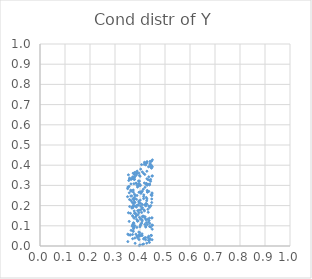
| Category | Series 0 |
|---|---|
| -100.0 | -100 |
| -100.0 | -100 |
| -100.0 | -100 |
| 0.4030961448478464 | 0.107 |
| -100.0 | -100 |
| -100.0 | -100 |
| -100.0 | -100 |
| -100.0 | -100 |
| -100.0 | -100 |
| -100.0 | -100 |
| -100.0 | -100 |
| 0.37293624094596356 | 0.339 |
| -100.0 | -100 |
| -100.0 | -100 |
| -100.0 | -100 |
| -100.0 | -100 |
| -100.0 | -100 |
| -100.0 | -100 |
| -100.0 | -100 |
| -100.0 | -100 |
| -100.0 | -100 |
| 0.3800242393108513 | 0.216 |
| -100.0 | -100 |
| -100.0 | -100 |
| -100.0 | -100 |
| -100.0 | -100 |
| -100.0 | -100 |
| -100.0 | -100 |
| -100.0 | -100 |
| -100.0 | -100 |
| -100.0 | -100 |
| -100.0 | -100 |
| -100.0 | -100 |
| -100.0 | -100 |
| -100.0 | -100 |
| -100.0 | -100 |
| -100.0 | -100 |
| 0.4085836126790914 | 0.052 |
| -100.0 | -100 |
| -100.0 | -100 |
| -100.0 | -100 |
| -100.0 | -100 |
| -100.0 | -100 |
| -100.0 | -100 |
| -100.0 | -100 |
| 0.4129208425187807 | 0.148 |
| -100.0 | -100 |
| -100.0 | -100 |
| -100.0 | -100 |
| -100.0 | -100 |
| -100.0 | -100 |
| -100.0 | -100 |
| -100.0 | -100 |
| -100.0 | -100 |
| -100.0 | -100 |
| 0.37795517911840815 | 0.329 |
| -100.0 | -100 |
| -100.0 | -100 |
| -100.0 | -100 |
| -100.0 | -100 |
| -100.0 | -100 |
| -100.0 | -100 |
| 0.4089082786524332 | 0.124 |
| -100.0 | -100 |
| -100.0 | -100 |
| -100.0 | -100 |
| -100.0 | -100 |
| -100.0 | -100 |
| -100.0 | -100 |
| -100.0 | -100 |
| -100.0 | -100 |
| -100.0 | -100 |
| -100.0 | -100 |
| -100.0 | -100 |
| -100.0 | -100 |
| -100.0 | -100 |
| -100.0 | -100 |
| -100.0 | -100 |
| -100.0 | -100 |
| -100.0 | -100 |
| -100.0 | -100 |
| -100.0 | -100 |
| -100.0 | -100 |
| -100.0 | -100 |
| -100.0 | -100 |
| -100.0 | -100 |
| -100.0 | -100 |
| -100.0 | -100 |
| -100.0 | -100 |
| 0.3977890599794355 | 0.321 |
| -100.0 | -100 |
| 0.42225708203498835 | 0.031 |
| -100.0 | -100 |
| -100.0 | -100 |
| -100.0 | -100 |
| -100.0 | -100 |
| -100.0 | -100 |
| -100.0 | -100 |
| -100.0 | -100 |
| -100.0 | -100 |
| -100.0 | -100 |
| -100.0 | -100 |
| -100.0 | -100 |
| -100.0 | -100 |
| -100.0 | -100 |
| -100.0 | -100 |
| -100.0 | -100 |
| -100.0 | -100 |
| -100.0 | -100 |
| -100.0 | -100 |
| -100.0 | -100 |
| -100.0 | -100 |
| -100.0 | -100 |
| -100.0 | -100 |
| -100.0 | -100 |
| -100.0 | -100 |
| -100.0 | -100 |
| -100.0 | -100 |
| 0.44568755198835497 | 0.399 |
| -100.0 | -100 |
| -100.0 | -100 |
| -100.0 | -100 |
| -100.0 | -100 |
| -100.0 | -100 |
| -100.0 | -100 |
| 0.3881679715345008 | 0.36 |
| 0.37787363267203233 | 0.256 |
| -100.0 | -100 |
| -100.0 | -100 |
| -100.0 | -100 |
| -100.0 | -100 |
| -100.0 | -100 |
| -100.0 | -100 |
| -100.0 | -100 |
| -100.0 | -100 |
| -100.0 | -100 |
| -100.0 | -100 |
| -100.0 | -100 |
| -100.0 | -100 |
| -100.0 | -100 |
| -100.0 | -100 |
| -100.0 | -100 |
| -100.0 | -100 |
| -100.0 | -100 |
| -100.0 | -100 |
| -100.0 | -100 |
| -100.0 | -100 |
| -100.0 | -100 |
| -100.0 | -100 |
| 0.43490849082456196 | 0.198 |
| -100.0 | -100 |
| -100.0 | -100 |
| -100.0 | -100 |
| -100.0 | -100 |
| -100.0 | -100 |
| -100.0 | -100 |
| -100.0 | -100 |
| -100.0 | -100 |
| -100.0 | -100 |
| -100.0 | -100 |
| -100.0 | -100 |
| -100.0 | -100 |
| 0.39509629361360576 | 0.177 |
| -100.0 | -100 |
| -100.0 | -100 |
| -100.0 | -100 |
| -100.0 | -100 |
| -100.0 | -100 |
| -100.0 | -100 |
| -100.0 | -100 |
| -100.0 | -100 |
| -100.0 | -100 |
| -100.0 | -100 |
| -100.0 | -100 |
| -100.0 | -100 |
| -100.0 | -100 |
| -100.0 | -100 |
| -100.0 | -100 |
| -100.0 | -100 |
| -100.0 | -100 |
| -100.0 | -100 |
| -100.0 | -100 |
| -100.0 | -100 |
| -100.0 | -100 |
| -100.0 | -100 |
| -100.0 | -100 |
| -100.0 | -100 |
| -100.0 | -100 |
| -100.0 | -100 |
| -100.0 | -100 |
| -100.0 | -100 |
| -100.0 | -100 |
| -100.0 | -100 |
| -100.0 | -100 |
| -100.0 | -100 |
| -100.0 | -100 |
| -100.0 | -100 |
| -100.0 | -100 |
| -100.0 | -100 |
| -100.0 | -100 |
| -100.0 | -100 |
| -100.0 | -100 |
| -100.0 | -100 |
| -100.0 | -100 |
| -100.0 | -100 |
| -100.0 | -100 |
| -100.0 | -100 |
| -100.0 | -100 |
| -100.0 | -100 |
| -100.0 | -100 |
| -100.0 | -100 |
| -100.0 | -100 |
| -100.0 | -100 |
| -100.0 | -100 |
| -100.0 | -100 |
| -100.0 | -100 |
| -100.0 | -100 |
| -100.0 | -100 |
| -100.0 | -100 |
| -100.0 | -100 |
| -100.0 | -100 |
| -100.0 | -100 |
| -100.0 | -100 |
| -100.0 | -100 |
| -100.0 | -100 |
| -100.0 | -100 |
| 0.4151417506024939 | 0.253 |
| -100.0 | -100 |
| -100.0 | -100 |
| -100.0 | -100 |
| -100.0 | -100 |
| -100.0 | -100 |
| -100.0 | -100 |
| -100.0 | -100 |
| 0.40089803095129684 | 0.177 |
| -100.0 | -100 |
| -100.0 | -100 |
| -100.0 | -100 |
| -100.0 | -100 |
| -100.0 | -100 |
| -100.0 | -100 |
| -100.0 | -100 |
| -100.0 | -100 |
| -100.0 | -100 |
| -100.0 | -100 |
| -100.0 | -100 |
| -100.0 | -100 |
| -100.0 | -100 |
| -100.0 | -100 |
| -100.0 | -100 |
| -100.0 | -100 |
| 0.3764962696208588 | 0.137 |
| -100.0 | -100 |
| -100.0 | -100 |
| 0.37414906566845263 | 0.208 |
| -100.0 | -100 |
| -100.0 | -100 |
| -100.0 | -100 |
| -100.0 | -100 |
| 0.42750771989362524 | 0.37 |
| -100.0 | -100 |
| -100.0 | -100 |
| -100.0 | -100 |
| -100.0 | -100 |
| -100.0 | -100 |
| -100.0 | -100 |
| -100.0 | -100 |
| 0.37648879085468834 | 0.358 |
| -100.0 | -100 |
| -100.0 | -100 |
| -100.0 | -100 |
| -100.0 | -100 |
| -100.0 | -100 |
| -100.0 | -100 |
| -100.0 | -100 |
| -100.0 | -100 |
| -100.0 | -100 |
| -100.0 | -100 |
| -100.0 | -100 |
| -100.0 | -100 |
| -100.0 | -100 |
| -100.0 | -100 |
| -100.0 | -100 |
| -100.0 | -100 |
| -100.0 | -100 |
| -100.0 | -100 |
| -100.0 | -100 |
| -100.0 | -100 |
| -100.0 | -100 |
| -100.0 | -100 |
| -100.0 | -100 |
| -100.0 | -100 |
| -100.0 | -100 |
| -100.0 | -100 |
| -100.0 | -100 |
| -100.0 | -100 |
| -100.0 | -100 |
| -100.0 | -100 |
| -100.0 | -100 |
| -100.0 | -100 |
| -100.0 | -100 |
| 0.38062372653307 | 0.249 |
| -100.0 | -100 |
| -100.0 | -100 |
| 0.42388650170796616 | 0.411 |
| -100.0 | -100 |
| -100.0 | -100 |
| -100.0 | -100 |
| -100.0 | -100 |
| -100.0 | -100 |
| -100.0 | -100 |
| -100.0 | -100 |
| -100.0 | -100 |
| 0.4230365105791567 | 0.402 |
| -100.0 | -100 |
| -100.0 | -100 |
| -100.0 | -100 |
| -100.0 | -100 |
| -100.0 | -100 |
| -100.0 | -100 |
| -100.0 | -100 |
| -100.0 | -100 |
| -100.0 | -100 |
| -100.0 | -100 |
| -100.0 | -100 |
| -100.0 | -100 |
| -100.0 | -100 |
| -100.0 | -100 |
| -100.0 | -100 |
| -100.0 | -100 |
| -100.0 | -100 |
| -100.0 | -100 |
| -100.0 | -100 |
| -100.0 | -100 |
| 0.4459119407256118 | 0.385 |
| -100.0 | -100 |
| -100.0 | -100 |
| -100.0 | -100 |
| 0.3997254120917545 | 0.005 |
| 0.40097214013508375 | 0.227 |
| -100.0 | -100 |
| -100.0 | -100 |
| -100.0 | -100 |
| -100.0 | -100 |
| -100.0 | -100 |
| -100.0 | -100 |
| -100.0 | -100 |
| -100.0 | -100 |
| -100.0 | -100 |
| -100.0 | -100 |
| -100.0 | -100 |
| -100.0 | -100 |
| 0.41422850753729257 | 0.01 |
| -100.0 | -100 |
| -100.0 | -100 |
| -100.0 | -100 |
| -100.0 | -100 |
| 0.3919025857117391 | 0.125 |
| -100.0 | -100 |
| -100.0 | -100 |
| 0.3881530465880212 | 0.25 |
| -100.0 | -100 |
| -100.0 | -100 |
| -100.0 | -100 |
| -100.0 | -100 |
| -100.0 | -100 |
| -100.0 | -100 |
| 0.3846643258345378 | 0.35 |
| -100.0 | -100 |
| 0.40351559675746695 | 0.196 |
| -100.0 | -100 |
| -100.0 | -100 |
| -100.0 | -100 |
| -100.0 | -100 |
| -100.0 | -100 |
| -100.0 | -100 |
| -100.0 | -100 |
| -100.0 | -100 |
| -100.0 | -100 |
| -100.0 | -100 |
| -100.0 | -100 |
| -100.0 | -100 |
| -100.0 | -100 |
| -100.0 | -100 |
| -100.0 | -100 |
| -100.0 | -100 |
| -100.0 | -100 |
| -100.0 | -100 |
| -100.0 | -100 |
| -100.0 | -100 |
| -100.0 | -100 |
| -100.0 | -100 |
| -100.0 | -100 |
| -100.0 | -100 |
| -100.0 | -100 |
| -100.0 | -100 |
| -100.0 | -100 |
| -100.0 | -100 |
| -100.0 | -100 |
| -100.0 | -100 |
| -100.0 | -100 |
| -100.0 | -100 |
| -100.0 | -100 |
| -100.0 | -100 |
| -100.0 | -100 |
| -100.0 | -100 |
| -100.0 | -100 |
| -100.0 | -100 |
| -100.0 | -100 |
| -100.0 | -100 |
| -100.0 | -100 |
| -100.0 | -100 |
| -100.0 | -100 |
| -100.0 | -100 |
| -100.0 | -100 |
| -100.0 | -100 |
| -100.0 | -100 |
| -100.0 | -100 |
| -100.0 | -100 |
| -100.0 | -100 |
| -100.0 | -100 |
| -100.0 | -100 |
| -100.0 | -100 |
| -100.0 | -100 |
| -100.0 | -100 |
| -100.0 | -100 |
| 0.3632194606941388 | 0.247 |
| -100.0 | -100 |
| 0.38135871574812985 | 0.162 |
| -100.0 | -100 |
| -100.0 | -100 |
| -100.0 | -100 |
| -100.0 | -100 |
| -100.0 | -100 |
| -100.0 | -100 |
| -100.0 | -100 |
| 0.42220412948663666 | 0.41 |
| 0.38840045820306146 | 0.05 |
| -100.0 | -100 |
| 0.44885670360411867 | 0.083 |
| 0.37470683176174624 | 0.086 |
| -100.0 | -100 |
| -100.0 | -100 |
| -100.0 | -100 |
| -100.0 | -100 |
| -100.0 | -100 |
| -100.0 | -100 |
| -100.0 | -100 |
| -100.0 | -100 |
| -100.0 | -100 |
| -100.0 | -100 |
| -100.0 | -100 |
| -100.0 | -100 |
| -100.0 | -100 |
| 0.35510610959932787 | 0.324 |
| -100.0 | -100 |
| -100.0 | -100 |
| -100.0 | -100 |
| -100.0 | -100 |
| -100.0 | -100 |
| 0.3994907125852676 | 0.304 |
| -100.0 | -100 |
| 0.4300881285031578 | 0.268 |
| -100.0 | -100 |
| -100.0 | -100 |
| -100.0 | -100 |
| -100.0 | -100 |
| -100.0 | -100 |
| -100.0 | -100 |
| -100.0 | -100 |
| -100.0 | -100 |
| -100.0 | -100 |
| -100.0 | -100 |
| -100.0 | -100 |
| -100.0 | -100 |
| -100.0 | -100 |
| -100.0 | -100 |
| -100.0 | -100 |
| -100.0 | -100 |
| -100.0 | -100 |
| -100.0 | -100 |
| -100.0 | -100 |
| -100.0 | -100 |
| -100.0 | -100 |
| -100.0 | -100 |
| -100.0 | -100 |
| -100.0 | -100 |
| -100.0 | -100 |
| -100.0 | -100 |
| -100.0 | -100 |
| -100.0 | -100 |
| -100.0 | -100 |
| 0.3636141934805067 | 0.307 |
| -100.0 | -100 |
| 0.3584349514063586 | 0.336 |
| -100.0 | -100 |
| -100.0 | -100 |
| -100.0 | -100 |
| -100.0 | -100 |
| -100.0 | -100 |
| 0.4276176083186315 | 0.333 |
| -100.0 | -100 |
| -100.0 | -100 |
| -100.0 | -100 |
| -100.0 | -100 |
| -100.0 | -100 |
| -100.0 | -100 |
| -100.0 | -100 |
| -100.0 | -100 |
| -100.0 | -100 |
| 0.41569367302651905 | 0.146 |
| -100.0 | -100 |
| 0.4378130437369947 | 0.018 |
| -100.0 | -100 |
| -100.0 | -100 |
| -100.0 | -100 |
| -100.0 | -100 |
| -100.0 | -100 |
| -100.0 | -100 |
| -100.0 | -100 |
| -100.0 | -100 |
| -100.0 | -100 |
| -100.0 | -100 |
| -100.0 | -100 |
| -100.0 | -100 |
| -100.0 | -100 |
| -100.0 | -100 |
| -100.0 | -100 |
| -100.0 | -100 |
| -100.0 | -100 |
| -100.0 | -100 |
| -100.0 | -100 |
| -100.0 | -100 |
| -100.0 | -100 |
| -100.0 | -100 |
| -100.0 | -100 |
| -100.0 | -100 |
| 0.3953061486688313 | 0.361 |
| -100.0 | -100 |
| -100.0 | -100 |
| -100.0 | -100 |
| -100.0 | -100 |
| -100.0 | -100 |
| -100.0 | -100 |
| -100.0 | -100 |
| -100.0 | -100 |
| -100.0 | -100 |
| -100.0 | -100 |
| -100.0 | -100 |
| -100.0 | -100 |
| -100.0 | -100 |
| -100.0 | -100 |
| -100.0 | -100 |
| -100.0 | -100 |
| -100.0 | -100 |
| -100.0 | -100 |
| -100.0 | -100 |
| -100.0 | -100 |
| -100.0 | -100 |
| -100.0 | -100 |
| -100.0 | -100 |
| -100.0 | -100 |
| -100.0 | -100 |
| -100.0 | -100 |
| -100.0 | -100 |
| -100.0 | -100 |
| -100.0 | -100 |
| 0.44574250133393956 | 0.052 |
| -100.0 | -100 |
| -100.0 | -100 |
| -100.0 | -100 |
| -100.0 | -100 |
| -100.0 | -100 |
| -100.0 | -100 |
| -100.0 | -100 |
| -100.0 | -100 |
| -100.0 | -100 |
| -100.0 | -100 |
| -100.0 | -100 |
| -100.0 | -100 |
| -100.0 | -100 |
| -100.0 | -100 |
| -100.0 | -100 |
| -100.0 | -100 |
| -100.0 | -100 |
| -100.0 | -100 |
| -100.0 | -100 |
| -100.0 | -100 |
| -100.0 | -100 |
| -100.0 | -100 |
| -100.0 | -100 |
| -100.0 | -100 |
| -100.0 | -100 |
| -100.0 | -100 |
| -100.0 | -100 |
| -100.0 | -100 |
| -100.0 | -100 |
| -100.0 | -100 |
| -100.0 | -100 |
| -100.0 | -100 |
| -100.0 | -100 |
| -100.0 | -100 |
| -100.0 | -100 |
| -100.0 | -100 |
| -100.0 | -100 |
| -100.0 | -100 |
| -100.0 | -100 |
| -100.0 | -100 |
| 0.40057174041979404 | 0.269 |
| -100.0 | -100 |
| -100.0 | -100 |
| -100.0 | -100 |
| -100.0 | -100 |
| -100.0 | -100 |
| -100.0 | -100 |
| -100.0 | -100 |
| -100.0 | -100 |
| -100.0 | -100 |
| -100.0 | -100 |
| 0.38859910196205927 | 0.371 |
| -100.0 | -100 |
| 0.42056813430008044 | 0.144 |
| -100.0 | -100 |
| -100.0 | -100 |
| -100.0 | -100 |
| -100.0 | -100 |
| 0.4068826903459747 | 0.183 |
| -100.0 | -100 |
| -100.0 | -100 |
| -100.0 | -100 |
| -100.0 | -100 |
| -100.0 | -100 |
| -100.0 | -100 |
| -100.0 | -100 |
| -100.0 | -100 |
| -100.0 | -100 |
| 0.40848756509885453 | 0.129 |
| -100.0 | -100 |
| 0.3544601788902032 | 0.056 |
| -100.0 | -100 |
| -100.0 | -100 |
| -100.0 | -100 |
| -100.0 | -100 |
| -100.0 | -100 |
| -100.0 | -100 |
| -100.0 | -100 |
| -100.0 | -100 |
| -100.0 | -100 |
| -100.0 | -100 |
| -100.0 | -100 |
| -100.0 | -100 |
| 0.4479291262277878 | 0.346 |
| -100.0 | -100 |
| -100.0 | -100 |
| -100.0 | -100 |
| -100.0 | -100 |
| -100.0 | -100 |
| -100.0 | -100 |
| -100.0 | -100 |
| 0.3768238514534964 | 0.174 |
| 0.40177983139797113 | 0.134 |
| -100.0 | -100 |
| -100.0 | -100 |
| -100.0 | -100 |
| -100.0 | -100 |
| 0.4383077338607314 | 0.097 |
| -100.0 | -100 |
| 0.4234114934400831 | 0.198 |
| -100.0 | -100 |
| 0.408921498935647 | 0.27 |
| -100.0 | -100 |
| -100.0 | -100 |
| -100.0 | -100 |
| -100.0 | -100 |
| -100.0 | -100 |
| -100.0 | -100 |
| -100.0 | -100 |
| -100.0 | -100 |
| -100.0 | -100 |
| -100.0 | -100 |
| -100.0 | -100 |
| -100.0 | -100 |
| -100.0 | -100 |
| 0.35123393985179185 | 0.059 |
| -100.0 | -100 |
| -100.0 | -100 |
| -100.0 | -100 |
| -100.0 | -100 |
| -100.0 | -100 |
| -100.0 | -100 |
| -100.0 | -100 |
| 0.4422018611547983 | 0.391 |
| -100.0 | -100 |
| -100.0 | -100 |
| -100.0 | -100 |
| -100.0 | -100 |
| -100.0 | -100 |
| -100.0 | -100 |
| -100.0 | -100 |
| -100.0 | -100 |
| -100.0 | -100 |
| -100.0 | -100 |
| -100.0 | -100 |
| -100.0 | -100 |
| -100.0 | -100 |
| -100.0 | -100 |
| -100.0 | -100 |
| 0.43386015037734627 | 0.118 |
| -100.0 | -100 |
| -100.0 | -100 |
| -100.0 | -100 |
| -100.0 | -100 |
| -100.0 | -100 |
| -100.0 | -100 |
| -100.0 | -100 |
| 0.36682742458321493 | 0.332 |
| -100.0 | -100 |
| -100.0 | -100 |
| -100.0 | -100 |
| -100.0 | -100 |
| -100.0 | -100 |
| -100.0 | -100 |
| -100.0 | -100 |
| -100.0 | -100 |
| 0.43954444319227426 | 0.111 |
| 0.39593338749045826 | 0.055 |
| 0.4180381352778284 | 0.174 |
| -100.0 | -100 |
| -100.0 | -100 |
| -100.0 | -100 |
| -100.0 | -100 |
| -100.0 | -100 |
| -100.0 | -100 |
| -100.0 | -100 |
| -100.0 | -100 |
| -100.0 | -100 |
| -100.0 | -100 |
| -100.0 | -100 |
| -100.0 | -100 |
| -100.0 | -100 |
| -100.0 | -100 |
| -100.0 | -100 |
| -100.0 | -100 |
| -100.0 | -100 |
| -100.0 | -100 |
| -100.0 | -100 |
| -100.0 | -100 |
| -100.0 | -100 |
| -100.0 | -100 |
| 0.3805419981845628 | 0.013 |
| -100.0 | -100 |
| 0.4352672448828462 | 0.27 |
| -100.0 | -100 |
| -100.0 | -100 |
| 0.37065028924021803 | 0.342 |
| -100.0 | -100 |
| -100.0 | -100 |
| -100.0 | -100 |
| -100.0 | -100 |
| -100.0 | -100 |
| -100.0 | -100 |
| -100.0 | -100 |
| -100.0 | -100 |
| -100.0 | -100 |
| -100.0 | -100 |
| -100.0 | -100 |
| -100.0 | -100 |
| -100.0 | -100 |
| -100.0 | -100 |
| -100.0 | -100 |
| -100.0 | -100 |
| -100.0 | -100 |
| -100.0 | -100 |
| -100.0 | -100 |
| -100.0 | -100 |
| 0.3856203096537617 | 0.231 |
| -100.0 | -100 |
| -100.0 | -100 |
| -100.0 | -100 |
| -100.0 | -100 |
| -100.0 | -100 |
| -100.0 | -100 |
| -100.0 | -100 |
| -100.0 | -100 |
| -100.0 | -100 |
| -100.0 | -100 |
| -100.0 | -100 |
| -100.0 | -100 |
| -100.0 | -100 |
| -100.0 | -100 |
| -100.0 | -100 |
| -100.0 | -100 |
| -100.0 | -100 |
| -100.0 | -100 |
| -100.0 | -100 |
| -100.0 | -100 |
| -100.0 | -100 |
| -100.0 | -100 |
| -100.0 | -100 |
| 0.3958733654639357 | 0.266 |
| -100.0 | -100 |
| -100.0 | -100 |
| -100.0 | -100 |
| -100.0 | -100 |
| -100.0 | -100 |
| -100.0 | -100 |
| -100.0 | -100 |
| -100.0 | -100 |
| -100.0 | -100 |
| -100.0 | -100 |
| -100.0 | -100 |
| -100.0 | -100 |
| -100.0 | -100 |
| -100.0 | -100 |
| -100.0 | -100 |
| -100.0 | -100 |
| -100.0 | -100 |
| -100.0 | -100 |
| -100.0 | -100 |
| -100.0 | -100 |
| -100.0 | -100 |
| 0.3944454559245222 | 0.202 |
| -100.0 | -100 |
| -100.0 | -100 |
| -100.0 | -100 |
| 0.4053808492305456 | 0.267 |
| -100.0 | -100 |
| -100.0 | -100 |
| -100.0 | -100 |
| -100.0 | -100 |
| -100.0 | -100 |
| -100.0 | -100 |
| -100.0 | -100 |
| -100.0 | -100 |
| 0.44940633474598013 | 0.392 |
| -100.0 | -100 |
| -100.0 | -100 |
| -100.0 | -100 |
| 0.4470372600492457 | 0.233 |
| -100.0 | -100 |
| 0.37048247261781453 | 0.193 |
| -100.0 | -100 |
| -100.0 | -100 |
| -100.0 | -100 |
| -100.0 | -100 |
| -100.0 | -100 |
| -100.0 | -100 |
| -100.0 | -100 |
| -100.0 | -100 |
| -100.0 | -100 |
| -100.0 | -100 |
| 0.4277429579960583 | 0.413 |
| -100.0 | -100 |
| -100.0 | -100 |
| -100.0 | -100 |
| -100.0 | -100 |
| -100.0 | -100 |
| -100.0 | -100 |
| -100.0 | -100 |
| 0.4239915772143681 | 0.306 |
| -100.0 | -100 |
| -100.0 | -100 |
| -100.0 | -100 |
| -100.0 | -100 |
| -100.0 | -100 |
| -100.0 | -100 |
| -100.0 | -100 |
| -100.0 | -100 |
| -100.0 | -100 |
| -100.0 | -100 |
| -100.0 | -100 |
| -100.0 | -100 |
| -100.0 | -100 |
| -100.0 | -100 |
| -100.0 | -100 |
| -100.0 | -100 |
| -100.0 | -100 |
| -100.0 | -100 |
| -100.0 | -100 |
| -100.0 | -100 |
| -100.0 | -100 |
| -100.0 | -100 |
| -100.0 | -100 |
| -100.0 | -100 |
| -100.0 | -100 |
| 0.4459230196588442 | 0.419 |
| -100.0 | -100 |
| -100.0 | -100 |
| -100.0 | -100 |
| -100.0 | -100 |
| -100.0 | -100 |
| -100.0 | -100 |
| -100.0 | -100 |
| -100.0 | -100 |
| -100.0 | -100 |
| -100.0 | -100 |
| -100.0 | -100 |
| -100.0 | -100 |
| -100.0 | -100 |
| -100.0 | -100 |
| -100.0 | -100 |
| -100.0 | -100 |
| -100.0 | -100 |
| -100.0 | -100 |
| -100.0 | -100 |
| -100.0 | -100 |
| -100.0 | -100 |
| -100.0 | -100 |
| -100.0 | -100 |
| -100.0 | -100 |
| -100.0 | -100 |
| -100.0 | -100 |
| -100.0 | -100 |
| -100.0 | -100 |
| -100.0 | -100 |
| -100.0 | -100 |
| -100.0 | -100 |
| -100.0 | -100 |
| -100.0 | -100 |
| -100.0 | -100 |
| -100.0 | -100 |
| -100.0 | -100 |
| -100.0 | -100 |
| -100.0 | -100 |
| -100.0 | -100 |
| 0.3567418218544789 | 0.122 |
| -100.0 | -100 |
| -100.0 | -100 |
| -100.0 | -100 |
| -100.0 | -100 |
| -100.0 | -100 |
| -100.0 | -100 |
| -100.0 | -100 |
| -100.0 | -100 |
| 0.3900454722542318 | 0.292 |
| -100.0 | -100 |
| -100.0 | -100 |
| -100.0 | -100 |
| -100.0 | -100 |
| -100.0 | -100 |
| -100.0 | -100 |
| -100.0 | -100 |
| -100.0 | -100 |
| 0.39554008985942535 | 0.165 |
| -100.0 | -100 |
| -100.0 | -100 |
| -100.0 | -100 |
| -100.0 | -100 |
| -100.0 | -100 |
| -100.0 | -100 |
| -100.0 | -100 |
| -100.0 | -100 |
| -100.0 | -100 |
| -100.0 | -100 |
| -100.0 | -100 |
| -100.0 | -100 |
| -100.0 | -100 |
| -100.0 | -100 |
| 0.44041304510882195 | 0.419 |
| -100.0 | -100 |
| -100.0 | -100 |
| -100.0 | -100 |
| 0.4027283516295592 | 0.38 |
| -100.0 | -100 |
| -100.0 | -100 |
| -100.0 | -100 |
| -100.0 | -100 |
| -100.0 | -100 |
| -100.0 | -100 |
| -100.0 | -100 |
| -100.0 | -100 |
| 0.3754220171293402 | 0.235 |
| -100.0 | -100 |
| -100.0 | -100 |
| -100.0 | -100 |
| -100.0 | -100 |
| 0.43202900119663223 | 0.306 |
| -100.0 | -100 |
| 0.3636213073115775 | 0.33 |
| -100.0 | -100 |
| -100.0 | -100 |
| -100.0 | -100 |
| -100.0 | -100 |
| -100.0 | -100 |
| -100.0 | -100 |
| -100.0 | -100 |
| 0.40162942958442516 | 0.102 |
| -100.0 | -100 |
| -100.0 | -100 |
| -100.0 | -100 |
| -100.0 | -100 |
| -100.0 | -100 |
| -100.0 | -100 |
| 0.38339735903410466 | 0.059 |
| -100.0 | -100 |
| -100.0 | -100 |
| -100.0 | -100 |
| -100.0 | -100 |
| -100.0 | -100 |
| -100.0 | -100 |
| -100.0 | -100 |
| 0.4156981590084866 | 0.179 |
| -100.0 | -100 |
| -100.0 | -100 |
| -100.0 | -100 |
| -100.0 | -100 |
| 0.37336338184958917 | 0.197 |
| 0.38572092831164917 | 0.31 |
| -100.0 | -100 |
| -100.0 | -100 |
| -100.0 | -100 |
| 0.4366118023169907 | 0.126 |
| -100.0 | -100 |
| -100.0 | -100 |
| -100.0 | -100 |
| -100.0 | -100 |
| -100.0 | -100 |
| -100.0 | -100 |
| -100.0 | -100 |
| -100.0 | -100 |
| -100.0 | -100 |
| -100.0 | -100 |
| -100.0 | -100 |
| -100.0 | -100 |
| -100.0 | -100 |
| 0.43233284855454623 | 0.041 |
| -100.0 | -100 |
| -100.0 | -100 |
| -100.0 | -100 |
| -100.0 | -100 |
| -100.0 | -100 |
| -100.0 | -100 |
| -100.0 | -100 |
| -100.0 | -100 |
| -100.0 | -100 |
| -100.0 | -100 |
| -100.0 | -100 |
| -100.0 | -100 |
| -100.0 | -100 |
| -100.0 | -100 |
| -100.0 | -100 |
| 0.4399360455344856 | 0.037 |
| -100.0 | -100 |
| -100.0 | -100 |
| -100.0 | -100 |
| -100.0 | -100 |
| -100.0 | -100 |
| -100.0 | -100 |
| -100.0 | -100 |
| -100.0 | -100 |
| -100.0 | -100 |
| -100.0 | -100 |
| -100.0 | -100 |
| -100.0 | -100 |
| -100.0 | -100 |
| -100.0 | -100 |
| -100.0 | -100 |
| -100.0 | -100 |
| -100.0 | -100 |
| -100.0 | -100 |
| -100.0 | -100 |
| -100.0 | -100 |
| -100.0 | -100 |
| -100.0 | -100 |
| 0.41082679942297173 | 0.147 |
| -100.0 | -100 |
| -100.0 | -100 |
| -100.0 | -100 |
| -100.0 | -100 |
| 0.40218182751071285 | 0.211 |
| -100.0 | -100 |
| -100.0 | -100 |
| -100.0 | -100 |
| -100.0 | -100 |
| -100.0 | -100 |
| -100.0 | -100 |
| 0.3719389490064119 | 0.101 |
| -100.0 | -100 |
| -100.0 | -100 |
| -100.0 | -100 |
| -100.0 | -100 |
| 0.44248520715200723 | 0.32 |
| -100.0 | -100 |
| -100.0 | -100 |
| -100.0 | -100 |
| -100.0 | -100 |
| -100.0 | -100 |
| -100.0 | -100 |
| -100.0 | -100 |
| -100.0 | -100 |
| -100.0 | -100 |
| 0.4145333939830046 | 0.245 |
| -100.0 | -100 |
| -100.0 | -100 |
| -100.0 | -100 |
| -100.0 | -100 |
| 0.3572015506890095 | 0.263 |
| -100.0 | -100 |
| -100.0 | -100 |
| -100.0 | -100 |
| -100.0 | -100 |
| -100.0 | -100 |
| -100.0 | -100 |
| -100.0 | -100 |
| -100.0 | -100 |
| -100.0 | -100 |
| 0.398169270018518 | 0.349 |
| -100.0 | -100 |
| -100.0 | -100 |
| -100.0 | -100 |
| -100.0 | -100 |
| -100.0 | -100 |
| -100.0 | -100 |
| -100.0 | -100 |
| -100.0 | -100 |
| -100.0 | -100 |
| -100.0 | -100 |
| -100.0 | -100 |
| -100.0 | -100 |
| -100.0 | -100 |
| -100.0 | -100 |
| -100.0 | -100 |
| -100.0 | -100 |
| -100.0 | -100 |
| -100.0 | -100 |
| -100.0 | -100 |
| -100.0 | -100 |
| -100.0 | -100 |
| -100.0 | -100 |
| -100.0 | -100 |
| -100.0 | -100 |
| -100.0 | -100 |
| -100.0 | -100 |
| -100.0 | -100 |
| -100.0 | -100 |
| -100.0 | -100 |
| -100.0 | -100 |
| -100.0 | -100 |
| -100.0 | -100 |
| -100.0 | -100 |
| -100.0 | -100 |
| -100.0 | -100 |
| -100.0 | -100 |
| 0.4228387317384106 | 0.098 |
| 0.4083629916941999 | 0.06 |
| -100.0 | -100 |
| -100.0 | -100 |
| -100.0 | -100 |
| -100.0 | -100 |
| -100.0 | -100 |
| 0.35073135641658815 | 0.284 |
| -100.0 | -100 |
| -100.0 | -100 |
| -100.0 | -100 |
| -100.0 | -100 |
| -100.0 | -100 |
| -100.0 | -100 |
| -100.0 | -100 |
| -100.0 | -100 |
| -100.0 | -100 |
| -100.0 | -100 |
| -100.0 | -100 |
| 0.373234110145225 | 0.072 |
| -100.0 | -100 |
| -100.0 | -100 |
| -100.0 | -100 |
| -100.0 | -100 |
| 0.42516009008882727 | 0.116 |
| -100.0 | -100 |
| -100.0 | -100 |
| -100.0 | -100 |
| 0.3725899020110006 | 0.36 |
| -100.0 | -100 |
| -100.0 | -100 |
| 0.419818761606783 | 0.29 |
| -100.0 | -100 |
| -100.0 | -100 |
| -100.0 | -100 |
| -100.0 | -100 |
| -100.0 | -100 |
| -100.0 | -100 |
| -100.0 | -100 |
| -100.0 | -100 |
| -100.0 | -100 |
| -100.0 | -100 |
| -100.0 | -100 |
| -100.0 | -100 |
| 0.41296570814410527 | 0.281 |
| -100.0 | -100 |
| 0.38032694818935897 | 0.365 |
| -100.0 | -100 |
| -100.0 | -100 |
| -100.0 | -100 |
| -100.0 | -100 |
| -100.0 | -100 |
| -100.0 | -100 |
| -100.0 | -100 |
| -100.0 | -100 |
| -100.0 | -100 |
| -100.0 | -100 |
| 0.35273279055620044 | 0.293 |
| -100.0 | -100 |
| -100.0 | -100 |
| -100.0 | -100 |
| -100.0 | -100 |
| -100.0 | -100 |
| 0.4483200163928419 | 0.103 |
| -100.0 | -100 |
| -100.0 | -100 |
| -100.0 | -100 |
| -100.0 | -100 |
| -100.0 | -100 |
| -100.0 | -100 |
| 0.3513999025277409 | 0.022 |
| -100.0 | -100 |
| -100.0 | -100 |
| -100.0 | -100 |
| -100.0 | -100 |
| -100.0 | -100 |
| -100.0 | -100 |
| -100.0 | -100 |
| -100.0 | -100 |
| -100.0 | -100 |
| -100.0 | -100 |
| -100.0 | -100 |
| -100.0 | -100 |
| -100.0 | -100 |
| -100.0 | -100 |
| -100.0 | -100 |
| -100.0 | -100 |
| -100.0 | -100 |
| -100.0 | -100 |
| -100.0 | -100 |
| -100.0 | -100 |
| -100.0 | -100 |
| -100.0 | -100 |
| 0.36890407676926773 | 0.098 |
| 0.41424606638797346 | 0.035 |
| -100.0 | -100 |
| -100.0 | -100 |
| -100.0 | -100 |
| -100.0 | -100 |
| -100.0 | -100 |
| -100.0 | -100 |
| 0.4278034354273179 | 0.233 |
| -100.0 | -100 |
| -100.0 | -100 |
| 0.37991293260926506 | 0.199 |
| 0.38605471480781706 | 0.15 |
| -100.0 | -100 |
| -100.0 | -100 |
| -100.0 | -100 |
| -100.0 | -100 |
| -100.0 | -100 |
| -100.0 | -100 |
| -100.0 | -100 |
| -100.0 | -100 |
| -100.0 | -100 |
| -100.0 | -100 |
| -100.0 | -100 |
| 0.38663789310811447 | 0.131 |
| -100.0 | -100 |
| -100.0 | -100 |
| -100.0 | -100 |
| -100.0 | -100 |
| -100.0 | -100 |
| -100.0 | -100 |
| -100.0 | -100 |
| 0.37015008545968997 | 0.15 |
| -100.0 | -100 |
| 0.3653696438836891 | 0.272 |
| -100.0 | -100 |
| -100.0 | -100 |
| 0.4038928767711809 | 0.052 |
| -100.0 | -100 |
| -100.0 | -100 |
| -100.0 | -100 |
| -100.0 | -100 |
| -100.0 | -100 |
| -100.0 | -100 |
| -100.0 | -100 |
| -100.0 | -100 |
| -100.0 | -100 |
| -100.0 | -100 |
| -100.0 | -100 |
| 0.39527628080837907 | 0.069 |
| -100.0 | -100 |
| -100.0 | -100 |
| -100.0 | -100 |
| -100.0 | -100 |
| -100.0 | -100 |
| -100.0 | -100 |
| -100.0 | -100 |
| -100.0 | -100 |
| -100.0 | -100 |
| -100.0 | -100 |
| 0.3644516299138789 | 0.225 |
| -100.0 | -100 |
| -100.0 | -100 |
| -100.0 | -100 |
| -100.0 | -100 |
| -100.0 | -100 |
| -100.0 | -100 |
| -100.0 | -100 |
| -100.0 | -100 |
| -100.0 | -100 |
| -100.0 | -100 |
| 0.3940708412352427 | 0.322 |
| -100.0 | -100 |
| -100.0 | -100 |
| -100.0 | -100 |
| -100.0 | -100 |
| -100.0 | -100 |
| -100.0 | -100 |
| -100.0 | -100 |
| -100.0 | -100 |
| -100.0 | -100 |
| -100.0 | -100 |
| -100.0 | -100 |
| -100.0 | -100 |
| 0.3958828110608338 | 0.214 |
| -100.0 | -100 |
| 0.3903943566527289 | 0.04 |
| -100.0 | -100 |
| -100.0 | -100 |
| -100.0 | -100 |
| -100.0 | -100 |
| -100.0 | -100 |
| -100.0 | -100 |
| -100.0 | -100 |
| -100.0 | -100 |
| -100.0 | -100 |
| -100.0 | -100 |
| -100.0 | -100 |
| -100.0 | -100 |
| -100.0 | -100 |
| -100.0 | -100 |
| -100.0 | -100 |
| -100.0 | -100 |
| 0.3770332078973788 | 0.239 |
| -100.0 | -100 |
| -100.0 | -100 |
| -100.0 | -100 |
| -100.0 | -100 |
| -100.0 | -100 |
| -100.0 | -100 |
| -100.0 | -100 |
| -100.0 | -100 |
| -100.0 | -100 |
| -100.0 | -100 |
| -100.0 | -100 |
| -100.0 | -100 |
| -100.0 | -100 |
| -100.0 | -100 |
| -100.0 | -100 |
| -100.0 | -100 |
| -100.0 | -100 |
| -100.0 | -100 |
| -100.0 | -100 |
| -100.0 | -100 |
| -100.0 | -100 |
| -100.0 | -100 |
| -100.0 | -100 |
| -100.0 | -100 |
| -100.0 | -100 |
| -100.0 | -100 |
| -100.0 | -100 |
| -100.0 | -100 |
| -100.0 | -100 |
| -100.0 | -100 |
| -100.0 | -100 |
| -100.0 | -100 |
| -100.0 | -100 |
| -100.0 | -100 |
| -100.0 | -100 |
| -100.0 | -100 |
| -100.0 | -100 |
| 0.4495000105823914 | 0.347 |
| 0.37378137936374856 | 0.089 |
| -100.0 | -100 |
| -100.0 | -100 |
| -100.0 | -100 |
| -100.0 | -100 |
| -100.0 | -100 |
| -100.0 | -100 |
| -100.0 | -100 |
| -100.0 | -100 |
| -100.0 | -100 |
| -100.0 | -100 |
| -100.0 | -100 |
| -100.0 | -100 |
| -100.0 | -100 |
| -100.0 | -100 |
| -100.0 | -100 |
| -100.0 | -100 |
| -100.0 | -100 |
| -100.0 | -100 |
| -100.0 | -100 |
| -100.0 | -100 |
| -100.0 | -100 |
| -100.0 | -100 |
| -100.0 | -100 |
| -100.0 | -100 |
| -100.0 | -100 |
| -100.0 | -100 |
| 0.4204992430377935 | 0.137 |
| -100.0 | -100 |
| -100.0 | -100 |
| 0.3574775396597639 | 0.331 |
| 0.37787354099120574 | 0.162 |
| -100.0 | -100 |
| -100.0 | -100 |
| -100.0 | -100 |
| -100.0 | -100 |
| -100.0 | -100 |
| -100.0 | -100 |
| -100.0 | -100 |
| 0.39927242511274297 | 0.052 |
| -100.0 | -100 |
| -100.0 | -100 |
| -100.0 | -100 |
| -100.0 | -100 |
| -100.0 | -100 |
| -100.0 | -100 |
| -100.0 | -100 |
| 0.41675655565794945 | 0.404 |
| -100.0 | -100 |
| -100.0 | -100 |
| -100.0 | -100 |
| -100.0 | -100 |
| -100.0 | -100 |
| -100.0 | -100 |
| -100.0 | -100 |
| -100.0 | -100 |
| -100.0 | -100 |
| -100.0 | -100 |
| -100.0 | -100 |
| -100.0 | -100 |
| 0.4267462603847296 | 0.308 |
| -100.0 | -100 |
| -100.0 | -100 |
| -100.0 | -100 |
| -100.0 | -100 |
| -100.0 | -100 |
| -100.0 | -100 |
| -100.0 | -100 |
| -100.0 | -100 |
| -100.0 | -100 |
| -100.0 | -100 |
| -100.0 | -100 |
| -100.0 | -100 |
| -100.0 | -100 |
| -100.0 | -100 |
| -100.0 | -100 |
| -100.0 | -100 |
| -100.0 | -100 |
| -100.0 | -100 |
| -100.0 | -100 |
| 0.3959382964961826 | 0.032 |
| -100.0 | -100 |
| -100.0 | -100 |
| 0.44953499402665087 | 0.426 |
| -100.0 | -100 |
| -100.0 | -100 |
| -100.0 | -100 |
| -100.0 | -100 |
| -100.0 | -100 |
| -100.0 | -100 |
| -100.0 | -100 |
| -100.0 | -100 |
| -100.0 | -100 |
| -100.0 | -100 |
| -100.0 | -100 |
| -100.0 | -100 |
| -100.0 | -100 |
| -100.0 | -100 |
| -100.0 | -100 |
| -100.0 | -100 |
| -100.0 | -100 |
| -100.0 | -100 |
| -100.0 | -100 |
| 0.42417283377128 | 0.211 |
| -100.0 | -100 |
| -100.0 | -100 |
| -100.0 | -100 |
| -100.0 | -100 |
| -100.0 | -100 |
| -100.0 | -100 |
| -100.0 | -100 |
| -100.0 | -100 |
| -100.0 | -100 |
| -100.0 | -100 |
| -100.0 | -100 |
| -100.0 | -100 |
| -100.0 | -100 |
| -100.0 | -100 |
| -100.0 | -100 |
| -100.0 | -100 |
| -100.0 | -100 |
| 0.4481078160936488 | 0.263 |
| -100.0 | -100 |
| -100.0 | -100 |
| 0.43472733765061755 | 0.027 |
| 0.3618233463798043 | 0.162 |
| -100.0 | -100 |
| -100.0 | -100 |
| -100.0 | -100 |
| -100.0 | -100 |
| -100.0 | -100 |
| -100.0 | -100 |
| -100.0 | -100 |
| -100.0 | -100 |
| -100.0 | -100 |
| -100.0 | -100 |
| 0.4346781141865125 | 0.029 |
| -100.0 | -100 |
| -100.0 | -100 |
| -100.0 | -100 |
| -100.0 | -100 |
| -100.0 | -100 |
| -100.0 | -100 |
| -100.0 | -100 |
| -100.0 | -100 |
| -100.0 | -100 |
| -100.0 | -100 |
| -100.0 | -100 |
| -100.0 | -100 |
| -100.0 | -100 |
| 0.40392593984241976 | 0.134 |
| -100.0 | -100 |
| -100.0 | -100 |
| 0.4067580231367265 | 0.166 |
| -100.0 | -100 |
| -100.0 | -100 |
| -100.0 | -100 |
| -100.0 | -100 |
| -100.0 | -100 |
| -100.0 | -100 |
| -100.0 | -100 |
| 0.42876436361297454 | 0.275 |
| 0.4062585126635563 | 0.403 |
| -100.0 | -100 |
| -100.0 | -100 |
| -100.0 | -100 |
| -100.0 | -100 |
| -100.0 | -100 |
| -100.0 | -100 |
| -100.0 | -100 |
| -100.0 | -100 |
| 0.3793156802854153 | 0.039 |
| 0.406807356674565 | 0.114 |
| -100.0 | -100 |
| -100.0 | -100 |
| -100.0 | -100 |
| -100.0 | -100 |
| -100.0 | -100 |
| -100.0 | -100 |
| -100.0 | -100 |
| -100.0 | -100 |
| 0.37557949594148754 | 0.308 |
| -100.0 | -100 |
| -100.0 | -100 |
| -100.0 | -100 |
| 0.38378800490796505 | 0.311 |
| -100.0 | -100 |
| -100.0 | -100 |
| -100.0 | -100 |
| -100.0 | -100 |
| -100.0 | -100 |
| 0.35374448695751726 | 0.164 |
| -100.0 | -100 |
| -100.0 | -100 |
| -100.0 | -100 |
| -100.0 | -100 |
| -100.0 | -100 |
| -100.0 | -100 |
| -100.0 | -100 |
| -100.0 | -100 |
| -100.0 | -100 |
| -100.0 | -100 |
| -100.0 | -100 |
| -100.0 | -100 |
| -100.0 | -100 |
| -100.0 | -100 |
| -100.0 | -100 |
| -100.0 | -100 |
| -100.0 | -100 |
| -100.0 | -100 |
| -100.0 | -100 |
| -100.0 | -100 |
| -100.0 | -100 |
| 0.4294962723397785 | 0.267 |
| -100.0 | -100 |
| -100.0 | -100 |
| -100.0 | -100 |
| -100.0 | -100 |
| -100.0 | -100 |
| -100.0 | -100 |
| -100.0 | -100 |
| -100.0 | -100 |
| -100.0 | -100 |
| -100.0 | -100 |
| -100.0 | -100 |
| -100.0 | -100 |
| -100.0 | -100 |
| -100.0 | -100 |
| 0.3729246128504565 | 0.194 |
| -100.0 | -100 |
| -100.0 | -100 |
| -100.0 | -100 |
| -100.0 | -100 |
| -100.0 | -100 |
| -100.0 | -100 |
| -100.0 | -100 |
| -100.0 | -100 |
| -100.0 | -100 |
| -100.0 | -100 |
| -100.0 | -100 |
| -100.0 | -100 |
| -100.0 | -100 |
| 0.43295305681178653 | 0.167 |
| -100.0 | -100 |
| -100.0 | -100 |
| 0.40163518945362775 | 0.3 |
| -100.0 | -100 |
| -100.0 | -100 |
| -100.0 | -100 |
| -100.0 | -100 |
| -100.0 | -100 |
| -100.0 | -100 |
| -100.0 | -100 |
| -100.0 | -100 |
| -100.0 | -100 |
| -100.0 | -100 |
| -100.0 | -100 |
| -100.0 | -100 |
| -100.0 | -100 |
| 0.38208871893980423 | 0.16 |
| -100.0 | -100 |
| -100.0 | -100 |
| -100.0 | -100 |
| -100.0 | -100 |
| -100.0 | -100 |
| -100.0 | -100 |
| -100.0 | -100 |
| 0.36913923082227396 | 0.215 |
| -100.0 | -100 |
| -100.0 | -100 |
| -100.0 | -100 |
| -100.0 | -100 |
| -100.0 | -100 |
| -100.0 | -100 |
| -100.0 | -100 |
| -100.0 | -100 |
| -100.0 | -100 |
| -100.0 | -100 |
| -100.0 | -100 |
| -100.0 | -100 |
| -100.0 | -100 |
| -100.0 | -100 |
| -100.0 | -100 |
| -100.0 | -100 |
| -100.0 | -100 |
| -100.0 | -100 |
| -100.0 | -100 |
| -100.0 | -100 |
| -100.0 | -100 |
| -100.0 | -100 |
| -100.0 | -100 |
| -100.0 | -100 |
| -100.0 | -100 |
| -100.0 | -100 |
| -100.0 | -100 |
| -100.0 | -100 |
| -100.0 | -100 |
| 0.3722412599746071 | 0.198 |
| -100.0 | -100 |
| -100.0 | -100 |
| -100.0 | -100 |
| 0.4145423267966619 | 0.234 |
| -100.0 | -100 |
| -100.0 | -100 |
| -100.0 | -100 |
| -100.0 | -100 |
| -100.0 | -100 |
| -100.0 | -100 |
| -100.0 | -100 |
| -100.0 | -100 |
| -100.0 | -100 |
| -100.0 | -100 |
| -100.0 | -100 |
| -100.0 | -100 |
| -100.0 | -100 |
| -100.0 | -100 |
| -100.0 | -100 |
| -100.0 | -100 |
| -100.0 | -100 |
| -100.0 | -100 |
| -100.0 | -100 |
| -100.0 | -100 |
| -100.0 | -100 |
| -100.0 | -100 |
| -100.0 | -100 |
| -100.0 | -100 |
| -100.0 | -100 |
| -100.0 | -100 |
| -100.0 | -100 |
| -100.0 | -100 |
| -100.0 | -100 |
| -100.0 | -100 |
| -100.0 | -100 |
| -100.0 | -100 |
| -100.0 | -100 |
| -100.0 | -100 |
| -100.0 | -100 |
| -100.0 | -100 |
| -100.0 | -100 |
| -100.0 | -100 |
| -100.0 | -100 |
| -100.0 | -100 |
| -100.0 | -100 |
| -100.0 | -100 |
| -100.0 | -100 |
| 0.3869796075639774 | 0.358 |
| 0.3702774287429167 | 0.057 |
| -100.0 | -100 |
| -100.0 | -100 |
| 0.4483199810398846 | 0.139 |
| -100.0 | -100 |
| -100.0 | -100 |
| -100.0 | -100 |
| 0.3688740883837306 | 0.192 |
| 0.44686550065185016 | 0.215 |
| -100.0 | -100 |
| -100.0 | -100 |
| -100.0 | -100 |
| -100.0 | -100 |
| -100.0 | -100 |
| -100.0 | -100 |
| -100.0 | -100 |
| -100.0 | -100 |
| -100.0 | -100 |
| -100.0 | -100 |
| 0.4386905710369956 | 0.307 |
| -100.0 | -100 |
| -100.0 | -100 |
| -100.0 | -100 |
| -100.0 | -100 |
| -100.0 | -100 |
| -100.0 | -100 |
| -100.0 | -100 |
| -100.0 | -100 |
| -100.0 | -100 |
| -100.0 | -100 |
| -100.0 | -100 |
| -100.0 | -100 |
| 0.40909564242114993 | 0.145 |
| -100.0 | -100 |
| -100.0 | -100 |
| -100.0 | -100 |
| -100.0 | -100 |
| 0.44030790887253224 | 0.409 |
| 0.3956846738209545 | 0.309 |
| -100.0 | -100 |
| -100.0 | -100 |
| -100.0 | -100 |
| -100.0 | -100 |
| -100.0 | -100 |
| -100.0 | -100 |
| -100.0 | -100 |
| -100.0 | -100 |
| -100.0 | -100 |
| -100.0 | -100 |
| -100.0 | -100 |
| 0.3952820538016929 | 0.298 |
| -100.0 | -100 |
| -100.0 | -100 |
| -100.0 | -100 |
| -100.0 | -100 |
| 0.3517575873669062 | 0.29 |
| 0.39174493167405033 | 0.155 |
| -100.0 | -100 |
| -100.0 | -100 |
| -100.0 | -100 |
| 0.3626168177291925 | 0.276 |
| -100.0 | -100 |
| -100.0 | -100 |
| 0.42408832109385564 | 0.13 |
| -100.0 | -100 |
| -100.0 | -100 |
| -100.0 | -100 |
| -100.0 | -100 |
| -100.0 | -100 |
| 0.4004125219334841 | 0.345 |
| -100.0 | -100 |
| -100.0 | -100 |
| -100.0 | -100 |
| -100.0 | -100 |
| -100.0 | -100 |
| -100.0 | -100 |
| -100.0 | -100 |
| -100.0 | -100 |
| -100.0 | -100 |
| -100.0 | -100 |
| -100.0 | -100 |
| 0.3730560812534919 | 0.277 |
| -100.0 | -100 |
| -100.0 | -100 |
| 0.41014563016324757 | 0.007 |
| -100.0 | -100 |
| -100.0 | -100 |
| -100.0 | -100 |
| -100.0 | -100 |
| -100.0 | -100 |
| -100.0 | -100 |
| -100.0 | -100 |
| -100.0 | -100 |
| -100.0 | -100 |
| -100.0 | -100 |
| -100.0 | -100 |
| -100.0 | -100 |
| -100.0 | -100 |
| -100.0 | -100 |
| -100.0 | -100 |
| -100.0 | -100 |
| -100.0 | -100 |
| -100.0 | -100 |
| -100.0 | -100 |
| -100.0 | -100 |
| -100.0 | -100 |
| -100.0 | -100 |
| -100.0 | -100 |
| -100.0 | -100 |
| -100.0 | -100 |
| -100.0 | -100 |
| -100.0 | -100 |
| -100.0 | -100 |
| -100.0 | -100 |
| 0.42965968054514225 | 0.107 |
| -100.0 | -100 |
| -100.0 | -100 |
| -100.0 | -100 |
| -100.0 | -100 |
| -100.0 | -100 |
| -100.0 | -100 |
| -100.0 | -100 |
| -100.0 | -100 |
| -100.0 | -100 |
| -100.0 | -100 |
| -100.0 | -100 |
| -100.0 | -100 |
| -100.0 | -100 |
| -100.0 | -100 |
| -100.0 | -100 |
| -100.0 | -100 |
| -100.0 | -100 |
| -100.0 | -100 |
| -100.0 | -100 |
| -100.0 | -100 |
| -100.0 | -100 |
| -100.0 | -100 |
| -100.0 | -100 |
| -100.0 | -100 |
| -100.0 | -100 |
| -100.0 | -100 |
| -100.0 | -100 |
| -100.0 | -100 |
| -100.0 | -100 |
| -100.0 | -100 |
| -100.0 | -100 |
| -100.0 | -100 |
| -100.0 | -100 |
| -100.0 | -100 |
| -100.0 | -100 |
| -100.0 | -100 |
| -100.0 | -100 |
| -100.0 | -100 |
| -100.0 | -100 |
| -100.0 | -100 |
| -100.0 | -100 |
| 0.42273536420663715 | 0.042 |
| -100.0 | -100 |
| -100.0 | -100 |
| -100.0 | -100 |
| -100.0 | -100 |
| -100.0 | -100 |
| -100.0 | -100 |
| -100.0 | -100 |
| -100.0 | -100 |
| -100.0 | -100 |
| -100.0 | -100 |
| -100.0 | -100 |
| -100.0 | -100 |
| -100.0 | -100 |
| -100.0 | -100 |
| -100.0 | -100 |
| -100.0 | -100 |
| -100.0 | -100 |
| -100.0 | -100 |
| 0.3775335574598072 | 0.331 |
| 0.3751840616762062 | 0.112 |
| -100.0 | -100 |
| -100.0 | -100 |
| -100.0 | -100 |
| 0.4270951515460688 | 0.014 |
| -100.0 | -100 |
| 0.4190532701494428 | 0.107 |
| -100.0 | -100 |
| -100.0 | -100 |
| -100.0 | -100 |
| -100.0 | -100 |
| -100.0 | -100 |
| -100.0 | -100 |
| -100.0 | -100 |
| 0.3828190748394561 | 0.144 |
| -100.0 | -100 |
| -100.0 | -100 |
| -100.0 | -100 |
| -100.0 | -100 |
| -100.0 | -100 |
| -100.0 | -100 |
| -100.0 | -100 |
| -100.0 | -100 |
| -100.0 | -100 |
| -100.0 | -100 |
| -100.0 | -100 |
| 0.44234457905340663 | 0.33 |
| -100.0 | -100 |
| -100.0 | -100 |
| -100.0 | -100 |
| -100.0 | -100 |
| -100.0 | -100 |
| -100.0 | -100 |
| -100.0 | -100 |
| -100.0 | -100 |
| -100.0 | -100 |
| -100.0 | -100 |
| -100.0 | -100 |
| -100.0 | -100 |
| -100.0 | -100 |
| -100.0 | -100 |
| -100.0 | -100 |
| 0.43418186685509463 | 0.392 |
| -100.0 | -100 |
| -100.0 | -100 |
| -100.0 | -100 |
| -100.0 | -100 |
| -100.0 | -100 |
| -100.0 | -100 |
| -100.0 | -100 |
| -100.0 | -100 |
| -100.0 | -100 |
| -100.0 | -100 |
| -100.0 | -100 |
| -100.0 | -100 |
| -100.0 | -100 |
| -100.0 | -100 |
| -100.0 | -100 |
| -100.0 | -100 |
| -100.0 | -100 |
| -100.0 | -100 |
| -100.0 | -100 |
| -100.0 | -100 |
| -100.0 | -100 |
| -100.0 | -100 |
| -100.0 | -100 |
| -100.0 | -100 |
| -100.0 | -100 |
| -100.0 | -100 |
| 0.37909367636023017 | 0.101 |
| -100.0 | -100 |
| -100.0 | -100 |
| -100.0 | -100 |
| -100.0 | -100 |
| -100.0 | -100 |
| -100.0 | -100 |
| -100.0 | -100 |
| -100.0 | -100 |
| -100.0 | -100 |
| -100.0 | -100 |
| -100.0 | -100 |
| -100.0 | -100 |
| -100.0 | -100 |
| -100.0 | -100 |
| -100.0 | -100 |
| -100.0 | -100 |
| -100.0 | -100 |
| -100.0 | -100 |
| -100.0 | -100 |
| -100.0 | -100 |
| -100.0 | -100 |
| -100.0 | -100 |
| -100.0 | -100 |
| -100.0 | -100 |
| 0.41749274585128615 | 0.04 |
| -100.0 | -100 |
| -100.0 | -100 |
| -100.0 | -100 |
| -100.0 | -100 |
| -100.0 | -100 |
| -100.0 | -100 |
| -100.0 | -100 |
| -100.0 | -100 |
| -100.0 | -100 |
| -100.0 | -100 |
| -100.0 | -100 |
| -100.0 | -100 |
| 0.3766734736630266 | 0.094 |
| -100.0 | -100 |
| -100.0 | -100 |
| -100.0 | -100 |
| -100.0 | -100 |
| -100.0 | -100 |
| -100.0 | -100 |
| -100.0 | -100 |
| 0.43270703694577783 | 0.328 |
| -100.0 | -100 |
| -100.0 | -100 |
| -100.0 | -100 |
| -100.0 | -100 |
| -100.0 | -100 |
| 0.3976874722826981 | 0.142 |
| -100.0 | -100 |
| -100.0 | -100 |
| -100.0 | -100 |
| -100.0 | -100 |
| -100.0 | -100 |
| -100.0 | -100 |
| -100.0 | -100 |
| -100.0 | -100 |
| -100.0 | -100 |
| -100.0 | -100 |
| -100.0 | -100 |
| -100.0 | -100 |
| -100.0 | -100 |
| -100.0 | -100 |
| -100.0 | -100 |
| -100.0 | -100 |
| -100.0 | -100 |
| -100.0 | -100 |
| -100.0 | -100 |
| -100.0 | -100 |
| -100.0 | -100 |
| -100.0 | -100 |
| -100.0 | -100 |
| -100.0 | -100 |
| -100.0 | -100 |
| -100.0 | -100 |
| -100.0 | -100 |
| -100.0 | -100 |
| -100.0 | -100 |
| -100.0 | -100 |
| -100.0 | -100 |
| -100.0 | -100 |
| -100.0 | -100 |
| -100.0 | -100 |
| -100.0 | -100 |
| -100.0 | -100 |
| -100.0 | -100 |
| -100.0 | -100 |
| -100.0 | -100 |
| -100.0 | -100 |
| -100.0 | -100 |
| -100.0 | -100 |
| -100.0 | -100 |
| -100.0 | -100 |
| -100.0 | -100 |
| -100.0 | -100 |
| -100.0 | -100 |
| -100.0 | -100 |
| -100.0 | -100 |
| -100.0 | -100 |
| -100.0 | -100 |
| -100.0 | -100 |
| -100.0 | -100 |
| -100.0 | -100 |
| -100.0 | -100 |
| -100.0 | -100 |
| -100.0 | -100 |
| -100.0 | -100 |
| -100.0 | -100 |
| -100.0 | -100 |
| -100.0 | -100 |
| -100.0 | -100 |
| -100.0 | -100 |
| -100.0 | -100 |
| -100.0 | -100 |
| -100.0 | -100 |
| -100.0 | -100 |
| -100.0 | -100 |
| 0.43760257036821393 | 0.138 |
| -100.0 | -100 |
| -100.0 | -100 |
| -100.0 | -100 |
| -100.0 | -100 |
| -100.0 | -100 |
| -100.0 | -100 |
| -100.0 | -100 |
| -100.0 | -100 |
| -100.0 | -100 |
| -100.0 | -100 |
| 0.44846363480152396 | 0.031 |
| -100.0 | -100 |
| -100.0 | -100 |
| -100.0 | -100 |
| -100.0 | -100 |
| -100.0 | -100 |
| -100.0 | -100 |
| -100.0 | -100 |
| -100.0 | -100 |
| -100.0 | -100 |
| -100.0 | -100 |
| -100.0 | -100 |
| 0.37243650346902957 | 0.234 |
| -100.0 | -100 |
| -100.0 | -100 |
| -100.0 | -100 |
| -100.0 | -100 |
| -100.0 | -100 |
| -100.0 | -100 |
| -100.0 | -100 |
| -100.0 | -100 |
| -100.0 | -100 |
| -100.0 | -100 |
| -100.0 | -100 |
| -100.0 | -100 |
| -100.0 | -100 |
| -100.0 | -100 |
| -100.0 | -100 |
| -100.0 | -100 |
| -100.0 | -100 |
| -100.0 | -100 |
| -100.0 | -100 |
| -100.0 | -100 |
| -100.0 | -100 |
| -100.0 | -100 |
| -100.0 | -100 |
| -100.0 | -100 |
| 0.3585444463448849 | 0.195 |
| -100.0 | -100 |
| -100.0 | -100 |
| -100.0 | -100 |
| -100.0 | -100 |
| -100.0 | -100 |
| 0.38899417247383916 | 0.202 |
| -100.0 | -100 |
| -100.0 | -100 |
| -100.0 | -100 |
| 0.44003249874287365 | 0.326 |
| -100.0 | -100 |
| 0.44702839106977443 | 0.139 |
| -100.0 | -100 |
| -100.0 | -100 |
| -100.0 | -100 |
| -100.0 | -100 |
| -100.0 | -100 |
| 0.3675348493646706 | 0.188 |
| -100.0 | -100 |
| -100.0 | -100 |
| -100.0 | -100 |
| -100.0 | -100 |
| -100.0 | -100 |
| -100.0 | -100 |
| 0.4283041061743005 | 0.3 |
| -100.0 | -100 |
| -100.0 | -100 |
| -100.0 | -100 |
| -100.0 | -100 |
| -100.0 | -100 |
| -100.0 | -100 |
| -100.0 | -100 |
| -100.0 | -100 |
| -100.0 | -100 |
| 0.37355091905985927 | 0.332 |
| -100.0 | -100 |
| -100.0 | -100 |
| -100.0 | -100 |
| -100.0 | -100 |
| -100.0 | -100 |
| -100.0 | -100 |
| 0.42523574687591625 | 0.24 |
| -100.0 | -100 |
| -100.0 | -100 |
| 0.3768577282329556 | 0.23 |
| 0.43511214390414465 | 0.342 |
| -100.0 | -100 |
| -100.0 | -100 |
| -100.0 | -100 |
| -100.0 | -100 |
| -100.0 | -100 |
| -100.0 | -100 |
| -100.0 | -100 |
| 0.4145783410331624 | 0.359 |
| -100.0 | -100 |
| -100.0 | -100 |
| -100.0 | -100 |
| -100.0 | -100 |
| -100.0 | -100 |
| -100.0 | -100 |
| -100.0 | -100 |
| -100.0 | -100 |
| -100.0 | -100 |
| -100.0 | -100 |
| -100.0 | -100 |
| -100.0 | -100 |
| -100.0 | -100 |
| -100.0 | -100 |
| -100.0 | -100 |
| -100.0 | -100 |
| -100.0 | -100 |
| -100.0 | -100 |
| -100.0 | -100 |
| -100.0 | -100 |
| -100.0 | -100 |
| -100.0 | -100 |
| -100.0 | -100 |
| -100.0 | -100 |
| -100.0 | -100 |
| -100.0 | -100 |
| -100.0 | -100 |
| -100.0 | -100 |
| -100.0 | -100 |
| -100.0 | -100 |
| -100.0 | -100 |
| -100.0 | -100 |
| -100.0 | -100 |
| -100.0 | -100 |
| -100.0 | -100 |
| -100.0 | -100 |
| -100.0 | -100 |
| -100.0 | -100 |
| -100.0 | -100 |
| -100.0 | -100 |
| -100.0 | -100 |
| -100.0 | -100 |
| -100.0 | -100 |
| -100.0 | -100 |
| -100.0 | -100 |
| -100.0 | -100 |
| 0.3715695434484497 | 0.076 |
| -100.0 | -100 |
| -100.0 | -100 |
| -100.0 | -100 |
| -100.0 | -100 |
| -100.0 | -100 |
| -100.0 | -100 |
| -100.0 | -100 |
| -100.0 | -100 |
| -100.0 | -100 |
| -100.0 | -100 |
| -100.0 | -100 |
| -100.0 | -100 |
| -100.0 | -100 |
| -100.0 | -100 |
| -100.0 | -100 |
| 0.3602334746597101 | 0.054 |
| -100.0 | -100 |
| -100.0 | -100 |
| -100.0 | -100 |
| -100.0 | -100 |
| -100.0 | -100 |
| -100.0 | -100 |
| -100.0 | -100 |
| -100.0 | -100 |
| -100.0 | -100 |
| -100.0 | -100 |
| -100.0 | -100 |
| -100.0 | -100 |
| -100.0 | -100 |
| -100.0 | -100 |
| 0.3562351869784113 | 0.295 |
| 0.3891395452794393 | 0.3 |
| -100.0 | -100 |
| -100.0 | -100 |
| -100.0 | -100 |
| -100.0 | -100 |
| -100.0 | -100 |
| -100.0 | -100 |
| -100.0 | -100 |
| -100.0 | -100 |
| -100.0 | -100 |
| -100.0 | -100 |
| -100.0 | -100 |
| -100.0 | -100 |
| -100.0 | -100 |
| -100.0 | -100 |
| -100.0 | -100 |
| -100.0 | -100 |
| -100.0 | -100 |
| 0.35017713879678336 | 0.244 |
| -100.0 | -100 |
| -100.0 | -100 |
| -100.0 | -100 |
| -100.0 | -100 |
| -100.0 | -100 |
| 0.42667999654322764 | 0.224 |
| -100.0 | -100 |
| -100.0 | -100 |
| -100.0 | -100 |
| 0.43997878103461097 | 0.402 |
| -100.0 | -100 |
| -100.0 | -100 |
| 0.43061875279590556 | 0.133 |
| -100.0 | -100 |
| -100.0 | -100 |
| -100.0 | -100 |
| -100.0 | -100 |
| 0.3945991415939688 | 0.222 |
| 0.36441813835155534 | 0.077 |
| -100.0 | -100 |
| -100.0 | -100 |
| -100.0 | -100 |
| -100.0 | -100 |
| -100.0 | -100 |
| -100.0 | -100 |
| -100.0 | -100 |
| 0.3963660051045771 | 0.047 |
| -100.0 | -100 |
| -100.0 | -100 |
| -100.0 | -100 |
| -100.0 | -100 |
| -100.0 | -100 |
| 0.4315151319872098 | 0.182 |
| -100.0 | -100 |
| -100.0 | -100 |
| -100.0 | -100 |
| -100.0 | -100 |
| -100.0 | -100 |
| -100.0 | -100 |
| -100.0 | -100 |
| -100.0 | -100 |
| -100.0 | -100 |
| -100.0 | -100 |
| -100.0 | -100 |
| -100.0 | -100 |
| -100.0 | -100 |
| -100.0 | -100 |
| -100.0 | -100 |
| -100.0 | -100 |
| -100.0 | -100 |
| -100.0 | -100 |
| -100.0 | -100 |
| -100.0 | -100 |
| -100.0 | -100 |
| -100.0 | -100 |
| -100.0 | -100 |
| -100.0 | -100 |
| -100.0 | -100 |
| -100.0 | -100 |
| -100.0 | -100 |
| -100.0 | -100 |
| -100.0 | -100 |
| -100.0 | -100 |
| 0.3900877201973232 | 0.123 |
| -100.0 | -100 |
| -100.0 | -100 |
| -100.0 | -100 |
| -100.0 | -100 |
| -100.0 | -100 |
| -100.0 | -100 |
| -100.0 | -100 |
| -100.0 | -100 |
| -100.0 | -100 |
| -100.0 | -100 |
| -100.0 | -100 |
| -100.0 | -100 |
| -100.0 | -100 |
| -100.0 | -100 |
| -100.0 | -100 |
| -100.0 | -100 |
| -100.0 | -100 |
| -100.0 | -100 |
| -100.0 | -100 |
| -100.0 | -100 |
| -100.0 | -100 |
| -100.0 | -100 |
| -100.0 | -100 |
| -100.0 | -100 |
| -100.0 | -100 |
| -100.0 | -100 |
| -100.0 | -100 |
| -100.0 | -100 |
| -100.0 | -100 |
| -100.0 | -100 |
| -100.0 | -100 |
| -100.0 | -100 |
| -100.0 | -100 |
| -100.0 | -100 |
| -100.0 | -100 |
| 0.4346049673488238 | 0.048 |
| -100.0 | -100 |
| -100.0 | -100 |
| -100.0 | -100 |
| -100.0 | -100 |
| 0.44261927057859907 | 0.094 |
| -100.0 | -100 |
| -100.0 | -100 |
| -100.0 | -100 |
| -100.0 | -100 |
| 0.3777238624659658 | 0.353 |
| -100.0 | -100 |
| 0.44349023190535264 | 0.2 |
| -100.0 | -100 |
| -100.0 | -100 |
| 0.43854111130054096 | 0.191 |
| -100.0 | -100 |
| -100.0 | -100 |
| -100.0 | -100 |
| -100.0 | -100 |
| -100.0 | -100 |
| -100.0 | -100 |
| -100.0 | -100 |
| -100.0 | -100 |
| -100.0 | -100 |
| -100.0 | -100 |
| -100.0 | -100 |
| -100.0 | -100 |
| -100.0 | -100 |
| -100.0 | -100 |
| -100.0 | -100 |
| -100.0 | -100 |
| -100.0 | -100 |
| -100.0 | -100 |
| -100.0 | -100 |
| -100.0 | -100 |
| -100.0 | -100 |
| -100.0 | -100 |
| -100.0 | -100 |
| -100.0 | -100 |
| 0.42764755503969853 | 0.207 |
| -100.0 | -100 |
| -100.0 | -100 |
| 0.41778171584444956 | 0.414 |
| -100.0 | -100 |
| -100.0 | -100 |
| -100.0 | -100 |
| -100.0 | -100 |
| -100.0 | -100 |
| -100.0 | -100 |
| 0.3608428026717294 | 0.055 |
| -100.0 | -100 |
| 0.353696583254282 | 0.352 |
| -100.0 | -100 |
| -100.0 | -100 |
| -100.0 | -100 |
| -100.0 | -100 |
| -100.0 | -100 |
| -100.0 | -100 |
| -100.0 | -100 |
| -100.0 | -100 |
| 0.42291446588727 | 0.094 |
| -100.0 | -100 |
| -100.0 | -100 |
| -100.0 | -100 |
| -100.0 | -100 |
| -100.0 | -100 |
| -100.0 | -100 |
| -100.0 | -100 |
| -100.0 | -100 |
| -100.0 | -100 |
| -100.0 | -100 |
| -100.0 | -100 |
| -100.0 | -100 |
| -100.0 | -100 |
| -100.0 | -100 |
| -100.0 | -100 |
| -100.0 | -100 |
| -100.0 | -100 |
| -100.0 | -100 |
| -100.0 | -100 |
| 0.38784751446308696 | 0.049 |
| -100.0 | -100 |
| 0.3754232109753647 | 0.228 |
| -100.0 | -100 |
| -100.0 | -100 |
| -100.0 | -100 |
| -100.0 | -100 |
| -100.0 | -100 |
| -100.0 | -100 |
| -100.0 | -100 |
| -100.0 | -100 |
| -100.0 | -100 |
| -100.0 | -100 |
| -100.0 | -100 |
| -100.0 | -100 |
| 0.448218232964819 | 0.258 |
| -100.0 | -100 |
| -100.0 | -100 |
| -100.0 | -100 |
| -100.0 | -100 |
| -100.0 | -100 |
| -100.0 | -100 |
| -100.0 | -100 |
| -100.0 | -100 |
| -100.0 | -100 |
| -100.0 | -100 |
| -100.0 | -100 |
| -100.0 | -100 |
| -100.0 | -100 |
| -100.0 | -100 |
| -100.0 | -100 |
| 0.373382246539513 | 0.267 |
| -100.0 | -100 |
| -100.0 | -100 |
| -100.0 | -100 |
| -100.0 | -100 |
| -100.0 | -100 |
| -100.0 | -100 |
| -100.0 | -100 |
| -100.0 | -100 |
| -100.0 | -100 |
| -100.0 | -100 |
| -100.0 | -100 |
| -100.0 | -100 |
| -100.0 | -100 |
| -100.0 | -100 |
| -100.0 | -100 |
| 0.438009329753965 | 0.303 |
| -100.0 | -100 |
| -100.0 | -100 |
| -100.0 | -100 |
| -100.0 | -100 |
| -100.0 | -100 |
| -100.0 | -100 |
| -100.0 | -100 |
| -100.0 | -100 |
| -100.0 | -100 |
| -100.0 | -100 |
| -100.0 | -100 |
| 0.3973584390364393 | 0.002 |
| -100.0 | -100 |
| -100.0 | -100 |
| -100.0 | -100 |
| -100.0 | -100 |
| -100.0 | -100 |
| -100.0 | -100 |
| -100.0 | -100 |
| -100.0 | -100 |
| -100.0 | -100 |
| 0.4174827957031866 | 0.312 |
| -100.0 | -100 |
| 0.43997952487677094 | 0.032 |
| -100.0 | -100 |
| -100.0 | -100 |
| -100.0 | -100 |
| 0.39908455047494695 | 0.066 |
| -100.0 | -100 |
| 0.4444247335635162 | 0.253 |
| -100.0 | -100 |
| -100.0 | -100 |
| -100.0 | -100 |
| -100.0 | -100 |
| -100.0 | -100 |
| -100.0 | -100 |
| -100.0 | -100 |
| -100.0 | -100 |
| 0.41851740610497834 | 0.203 |
| -100.0 | -100 |
| -100.0 | -100 |
| -100.0 | -100 |
| -100.0 | -100 |
| -100.0 | -100 |
| -100.0 | -100 |
| -100.0 | -100 |
| -100.0 | -100 |
| -100.0 | -100 |
| -100.0 | -100 |
| -100.0 | -100 |
| -100.0 | -100 |
| -100.0 | -100 |
| -100.0 | -100 |
| -100.0 | -100 |
| -100.0 | -100 |
| -100.0 | -100 |
| -100.0 | -100 |
| -100.0 | -100 |
| -100.0 | -100 |
| -100.0 | -100 |
| -100.0 | -100 |
| 0.38771666297329943 | 0.092 |
| -100.0 | -100 |
| -100.0 | -100 |
| -100.0 | -100 |
| -100.0 | -100 |
| -100.0 | -100 |
| -100.0 | -100 |
| -100.0 | -100 |
| -100.0 | -100 |
| -100.0 | -100 |
| -100.0 | -100 |
| -100.0 | -100 |
| -100.0 | -100 |
| -100.0 | -100 |
| -100.0 | -100 |
| -100.0 | -100 |
| -100.0 | -100 |
| -100.0 | -100 |
| -100.0 | -100 |
| -100.0 | -100 |
| -100.0 | -100 |
| -100.0 | -100 |
| -100.0 | -100 |
| -100.0 | -100 |
| -100.0 | -100 |
| -100.0 | -100 |
| -100.0 | -100 |
| -100.0 | -100 |
| -100.0 | -100 |
| -100.0 | -100 |
| -100.0 | -100 |
| -100.0 | -100 |
| -100.0 | -100 |
| -100.0 | -100 |
| -100.0 | -100 |
| -100.0 | -100 |
| -100.0 | -100 |
| -100.0 | -100 |
| -100.0 | -100 |
| -100.0 | -100 |
| -100.0 | -100 |
| -100.0 | -100 |
| -100.0 | -100 |
| -100.0 | -100 |
| 0.40892916855602934 | 0.206 |
| -100.0 | -100 |
| -100.0 | -100 |
| -100.0 | -100 |
| -100.0 | -100 |
| -100.0 | -100 |
| 0.365844369388615 | 0.333 |
| -100.0 | -100 |
| 0.44438626267218195 | 0.053 |
| -100.0 | -100 |
| -100.0 | -100 |
| -100.0 | -100 |
| 0.35821733991421 | 0.23 |
| -100.0 | -100 |
| -100.0 | -100 |
| -100.0 | -100 |
| -100.0 | -100 |
| -100.0 | -100 |
| -100.0 | -100 |
| 0.42822169076386873 | 0.418 |
| -100.0 | -100 |
| -100.0 | -100 |
| 0.37100303548800595 | 0.189 |
| -100.0 | -100 |
| 0.3742668953984859 | 0.115 |
| -100.0 | -100 |
| -100.0 | -100 |
| -100.0 | -100 |
| -100.0 | -100 |
| -100.0 | -100 |
| -100.0 | -100 |
| -100.0 | -100 |
| -100.0 | -100 |
| -100.0 | -100 |
| -100.0 | -100 |
| -100.0 | -100 |
| 0.36666506426832857 | 0.248 |
| -100.0 | -100 |
| -100.0 | -100 |
| -100.0 | -100 |
| -100.0 | -100 |
| -100.0 | -100 |
| -100.0 | -100 |
| -100.0 | -100 |
| -100.0 | -100 |
| -100.0 | -100 |
| -100.0 | -100 |
| -100.0 | -100 |
| -100.0 | -100 |
| -100.0 | -100 |
| -100.0 | -100 |
| -100.0 | -100 |
| -100.0 | -100 |
| 0.3768688742397084 | 0.217 |
| -100.0 | -100 |
| -100.0 | -100 |
| -100.0 | -100 |
| 0.39061353000088817 | 0.175 |
| -100.0 | -100 |
| -100.0 | -100 |
| -100.0 | -100 |
| -100.0 | -100 |
| -100.0 | -100 |
| -100.0 | -100 |
| -100.0 | -100 |
| -100.0 | -100 |
| 0.42523597749629916 | 0.309 |
| -100.0 | -100 |
| -100.0 | -100 |
| -100.0 | -100 |
| -100.0 | -100 |
| -100.0 | -100 |
| -100.0 | -100 |
| -100.0 | -100 |
| -100.0 | -100 |
| -100.0 | -100 |
| 0.3999832181537809 | 0.095 |
| -100.0 | -100 |
| -100.0 | -100 |
| 0.37787317089164496 | 0.235 |
| -100.0 | -100 |
| -100.0 | -100 |
| -100.0 | -100 |
| -100.0 | -100 |
| 0.3713709003204122 | 0.108 |
| -100.0 | -100 |
| -100.0 | -100 |
| -100.0 | -100 |
| -100.0 | -100 |
| -100.0 | -100 |
| -100.0 | -100 |
| -100.0 | -100 |
| -100.0 | -100 |
| -100.0 | -100 |
| -100.0 | -100 |
| -100.0 | -100 |
| -100.0 | -100 |
| -100.0 | -100 |
| -100.0 | -100 |
| -100.0 | -100 |
| -100.0 | -100 |
| 0.41921926889632977 | 0.354 |
| -100.0 | -100 |
| -100.0 | -100 |
| -100.0 | -100 |
| -100.0 | -100 |
| -100.0 | -100 |
| -100.0 | -100 |
| -100.0 | -100 |
| -100.0 | -100 |
| 0.4094624319879723 | 0.367 |
| -100.0 | -100 |
| -100.0 | -100 |
| -100.0 | -100 |
| -100.0 | -100 |
| 0.4473486626733916 | 0.25 |
| -100.0 | -100 |
| 0.37887359934625064 | 0.342 |
| -100.0 | -100 |
| -100.0 | -100 |
| -100.0 | -100 |
| -100.0 | -100 |
| -100.0 | -100 |
| -100.0 | -100 |
| -100.0 | -100 |
| -100.0 | -100 |
| -100.0 | -100 |
| -100.0 | -100 |
| -100.0 | -100 |
| -100.0 | -100 |
| -100.0 | -100 |
| -100.0 | -100 |
| -100.0 | -100 |
| -100.0 | -100 |
| -100.0 | -100 |
| 0.37052142089530005 | 0.036 |
| 0.3707289104757071 | 0.103 |
| -100.0 | -100 |
| -100.0 | -100 |
| -100.0 | -100 |
| -100.0 | -100 |
| -100.0 | -100 |
| -100.0 | -100 |
| -100.0 | -100 |
| -100.0 | -100 |
| -100.0 | -100 |
| -100.0 | -100 |
| -100.0 | -100 |
| -100.0 | -100 |
| -100.0 | -100 |
| -100.0 | -100 |
| -100.0 | -100 |
| -100.0 | -100 |
| -100.0 | -100 |
| -100.0 | -100 |
| -100.0 | -100 |
| -100.0 | -100 |
| -100.0 | -100 |
| -100.0 | -100 |
| -100.0 | -100 |
| 0.40968241013061224 | 0.189 |
| -100.0 | -100 |
| -100.0 | -100 |
| -100.0 | -100 |
| -100.0 | -100 |
| -100.0 | -100 |
| -100.0 | -100 |
| -100.0 | -100 |
| -100.0 | -100 |
| -100.0 | -100 |
| -100.0 | -100 |
| -100.0 | -100 |
| -100.0 | -100 |
| -100.0 | -100 |
| -100.0 | -100 |
| 0.44997861338771716 | 0.103 |
| -100.0 | -100 |
| -100.0 | -100 |
| -100.0 | -100 |
| -100.0 | -100 |
| -100.0 | -100 |
| -100.0 | -100 |
| 0.3716505742604945 | 0.146 |
| 0.3856246045446504 | 0.193 |
| -100.0 | -100 |
| -100.0 | -100 |
| -100.0 | -100 |
| -100.0 | -100 |
| -100.0 | -100 |
| -100.0 | -100 |
| -100.0 | -100 |
| 0.4039578066483024 | 0.261 |
| -100.0 | -100 |
| -100.0 | -100 |
| -100.0 | -100 |
| -100.0 | -100 |
| -100.0 | -100 |
| -100.0 | -100 |
| -100.0 | -100 |
| -100.0 | -100 |